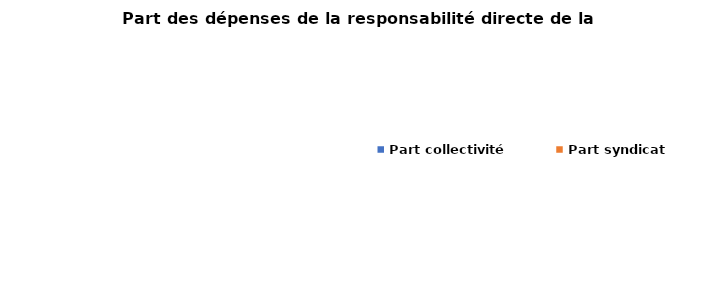
| Category | ETAPE 3 : Part des dépenses de la responsabilité directe de la collectivité |
|---|---|
| Part collectivité | 0 |
| Part syndicat | 0 |